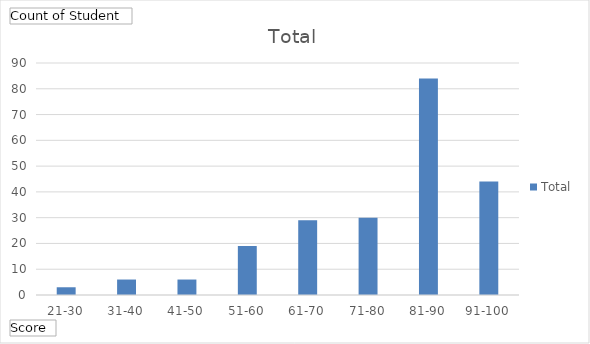
| Category | Total |
|---|---|
| 21-30 | 3 |
| 31-40 | 6 |
| 41-50 | 6 |
| 51-60 | 19 |
| 61-70 | 29 |
| 71-80 | 30 |
| 81-90 | 84 |
| 91-100 | 44 |